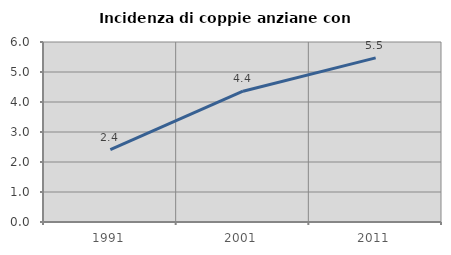
| Category | Incidenza di coppie anziane con figli |
|---|---|
| 1991.0 | 2.415 |
| 2001.0 | 4.359 |
| 2011.0 | 5.471 |